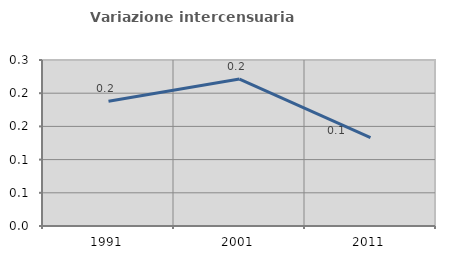
| Category | Variazione intercensuaria annua |
|---|---|
| 1991.0 | 0.188 |
| 2001.0 | 0.221 |
| 2011.0 | 0.133 |